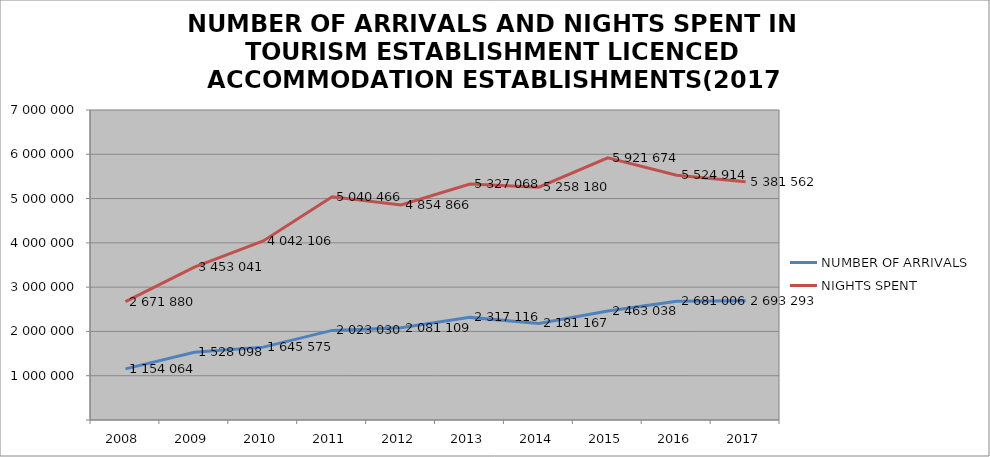
| Category | NUMBER OF ARRIVALS | NIGHTS SPENT |
|---|---|---|
| 2008 | 1154064 | 2671880 |
| 2009 | 1528098 | 3453041 |
| 2010 | 1645575 | 4042106 |
| 2011 | 2023030 | 5040466 |
| 2012 | 2081109 | 4854866 |
| 2013 | 2317116 | 5327068 |
| 2014 | 2181167 | 5258180 |
| 2015 | 2463038 | 5921674 |
| 2016 | 2681006 | 5524914 |
| 2017 | 2693293 | 5381562 |